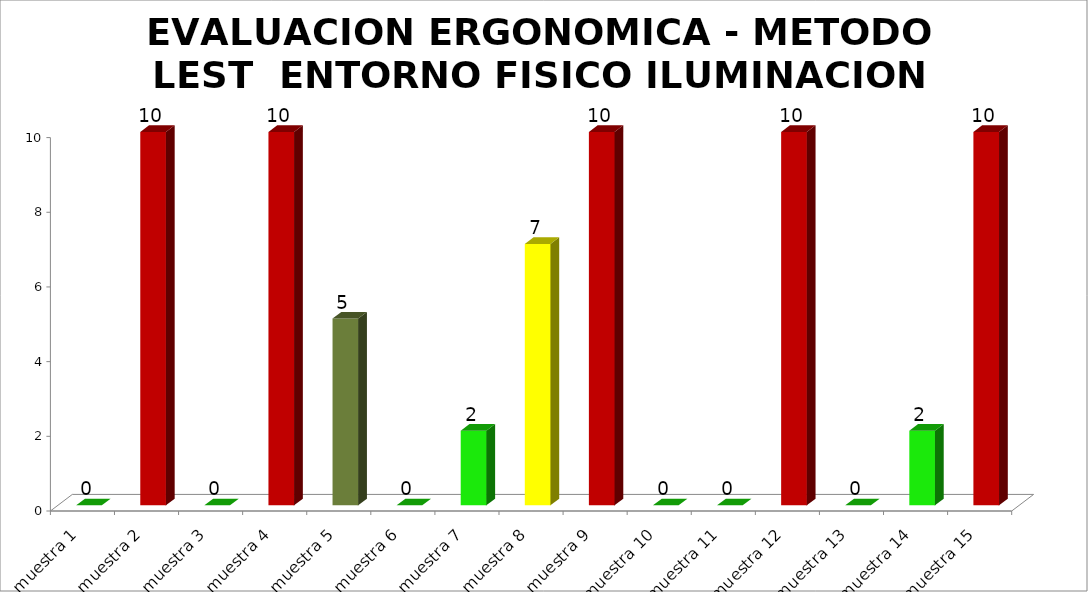
| Category | EVALUACION ERGONOMICA - METODO LEST  |
|---|---|
| muestra 1 | 0 |
| muestra 2 | 10 |
| muestra 3 | 0 |
| muestra 4 | 10 |
| muestra 5 | 5 |
| muestra 6 | 0 |
| muestra 7 | 2 |
| muestra 8 | 7 |
| muestra 9 | 10 |
| muestra 10 | 0 |
| muestra 11 | 0 |
| muestra 12 | 10 |
| muestra 13 | 0 |
| muestra 14 | 2 |
| muestra 15 | 10 |